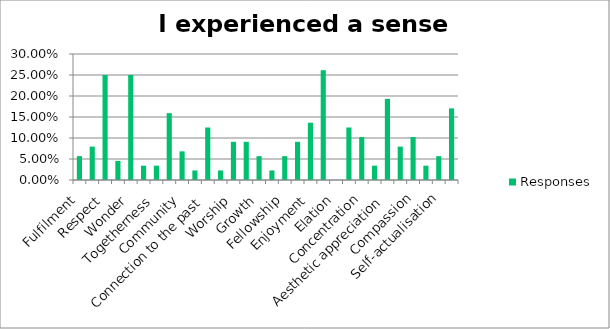
| Category | Responses |
|---|---|
| Fulfilment | 0.057 |
| Nostalgia | 0.08 |
| Respect | 0.25 |
| Grandeur | 0.046 |
| Wonder | 0.25 |
| Choice | 0.034 |
| Togetherness | 0.034 |
| Beauty | 0.159 |
| Community | 0.068 |
| Companionship | 0.023 |
| Connection to the past | 0.125 |
| Accomplishment | 0.023 |
| Worship | 0.091 |
| Appreciation of objects | 0.091 |
| Growth | 0.057 |
| Deciding | 0.023 |
| Fellowship | 0.057 |
| Self-discovery | 0.091 |
| Enjoyment | 0.136 |
| Pondering | 0.261 |
| Elation | 0 |
| Sacredness | 0.125 |
| Concentration | 0.102 |
| Attachment | 0.034 |
| Aesthetic appreciation | 0.193 |
| Connection with nature | 0.08 |
| Compassion | 0.102 |
| Connection with objects | 0.034 |
| Self-actualisation | 0.057 |
| None of these | 0.17 |